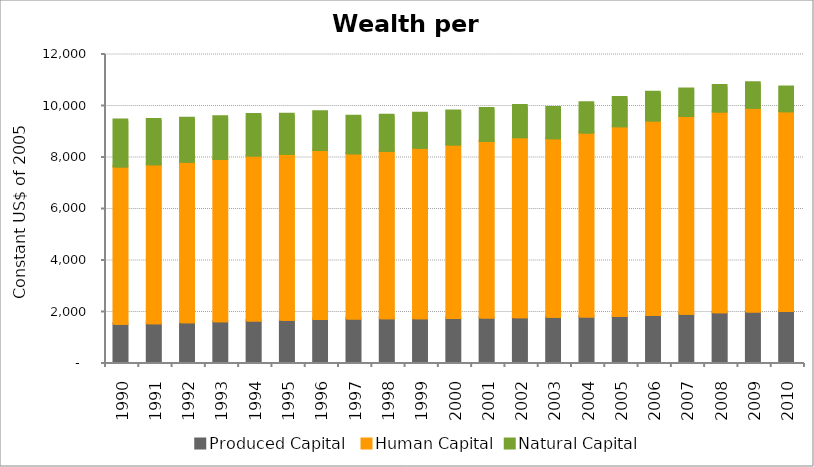
| Category | Produced Capital  | Human Capital | Natural Capital |
|---|---|---|---|
| 1990.0 | 1482.45 | 6113.397 | 1805.929 |
| 1991.0 | 1505.89 | 6170.62 | 1743.559 |
| 1992.0 | 1541.4 | 6234.471 | 1687.431 |
| 1993.0 | 1577.952 | 6309.49 | 1639.766 |
| 1994.0 | 1607.628 | 6411.436 | 1587.959 |
| 1995.0 | 1636.928 | 6446.192 | 1535.25 |
| 1996.0 | 1666.706 | 6570.878 | 1484.836 |
| 1997.0 | 1685.444 | 6417.09 | 1439.112 |
| 1998.0 | 1695.779 | 6502.313 | 1388.965 |
| 1999.0 | 1699.454 | 6619.551 | 1340.156 |
| 2000.0 | 1708.933 | 6740.763 | 1297.957 |
| 2001.0 | 1723.722 | 6859.489 | 1262.698 |
| 2002.0 | 1737.694 | 6994.989 | 1228.142 |
| 2003.0 | 1755.255 | 6934.009 | 1192.51 |
| 2004.0 | 1763.395 | 7147.217 | 1154.561 |
| 2005.0 | 1783.342 | 7372.333 | 1120.646 |
| 2006.0 | 1823.178 | 7558.383 | 1089.779 |
| 2007.0 | 1876.961 | 7677.179 | 1048.329 |
| 2008.0 | 1936.022 | 7794.932 | 1004.452 |
| 2009.0 | 1964.548 | 7909.251 | 973.703 |
| 2010.0 | 1980.726 | 7756.533 | 941.951 |